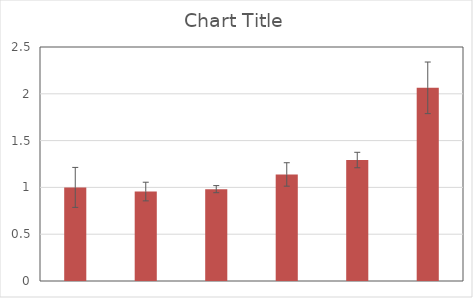
| Category | Series 1 |
|---|---|
| 0 | 1 |
| 1 | 0.956 |
| 2 | 0.981 |
| 3 | 1.138 |
| 4 | 1.292 |
| 5 | 2.064 |